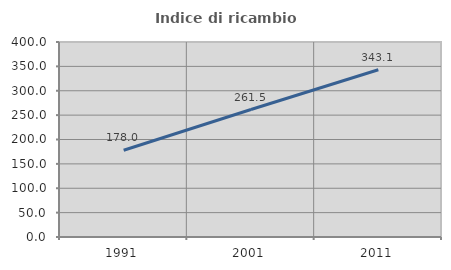
| Category | Indice di ricambio occupazionale  |
|---|---|
| 1991.0 | 178.049 |
| 2001.0 | 261.481 |
| 2011.0 | 343.066 |